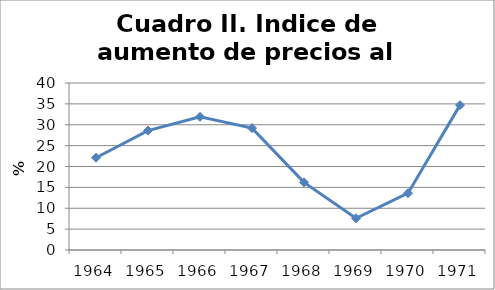
| Category | Tasa |
|---|---|
| 1964.0 | 22.1 |
| 1965.0 | 28.6 |
| 1966.0 | 31.9 |
| 1967.0 | 29.2 |
| 1968.0 | 16.2 |
| 1969.0 | 7.6 |
| 1970.0 | 13.6 |
| 1971.0 | 34.7 |